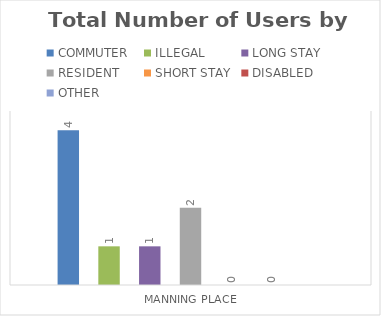
| Category | COMMUTER | ILLEGAL | LONG STAY | RESIDENT | SHORT STAY | DISABLED | OTHER |
|---|---|---|---|---|---|---|---|
| MANNING PLACE | 4 | 1 | 1 | 2 | 0 | 0 | 0 |